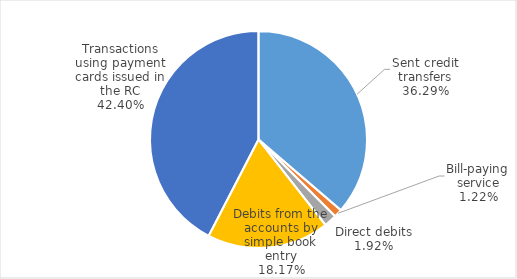
| Category | number of transactions |
|---|---|
| Sent credit transfers | 380795737 |
| Bill-paying service | 12813576 |
| Direct debits | 20117260 |
| Debits from the accounts by simple book entry | 190682414 |
| Transactions using payment cards issued in the RC | 444944049 |